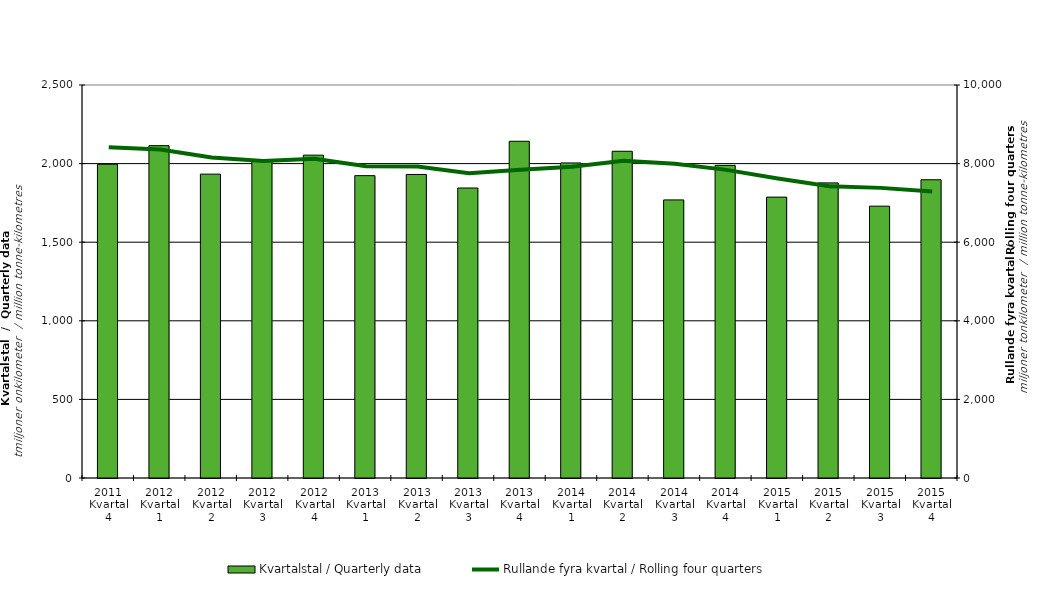
| Category | Kvartalstal / Quarterly data |
|---|---|
| 2011 Kvartal 4 | 1995.897 |
| 2012 Kvartal 1 | 2114.225 |
| 2012 Kvartal 2 | 1932.987 |
| 2012 Kvartal 3 | 2020.1 |
| 2012 Kvartal 4 | 2053.722 |
| 2013 Kvartal 1 | 1923.402 |
| 2013 Kvartal 2 | 1931.023 |
| 2013 Kvartal 3 | 1844.768 |
| 2013 Kvartal 4 | 2142.032 |
| 2014 Kvartal 1 | 2004.251 |
| 2014 Kvartal 2 | 2078.529 |
| 2014 Kvartal 3 | 1768.998 |
| 2014 Kvartal 4 | 1988.83 |
| 2015 Kvartal 1 | 1786.831 |
| 2015 Kvartal 2 | 1877.331 |
| 2015 Kvartal 3 | 1729.334 |
| 2015 Kvartal 4 | 1897.318 |